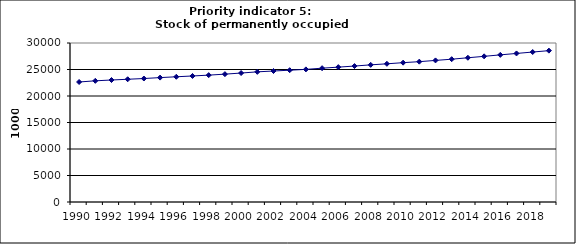
| Category | Stock of permanently occupied dwellings, 1000 |
|---|---|
| 1990 | 22643.922 |
| 1991 | 22862.734 |
| 1992 | 23016.502 |
| 1993 | 23159.711 |
| 1994 | 23298.46 |
| 1995 | 23470.105 |
| 1996 | 23627.609 |
| 1997 | 23777.987 |
| 1998 | 23937.522 |
| 1999 | 24122.857 |
| 2000 | 24333.192 |
| 2001 | 24557.508 |
| 2002 | 24714.518 |
| 2003 | 24867.87 |
| 2004 | 25022.034 |
| 2005 | 25249.505 |
| 2006 | 25445.964 |
| 2007 | 25650.572 |
| 2008 | 25875.694 |
| 2009 | 26075.474 |
| 2010 | 26288.643 |
| 2011 | 26477.045 |
| 2012 | 26714.454 |
| 2013 | 26944.184 |
| 2014 | 27214.168 |
| 2015 | 27484.27 |
| 2016 | 27761.889 |
| 2017 | 28029.823 |
| 2018 | 28294.751 |
| 2019 | 28556.278 |